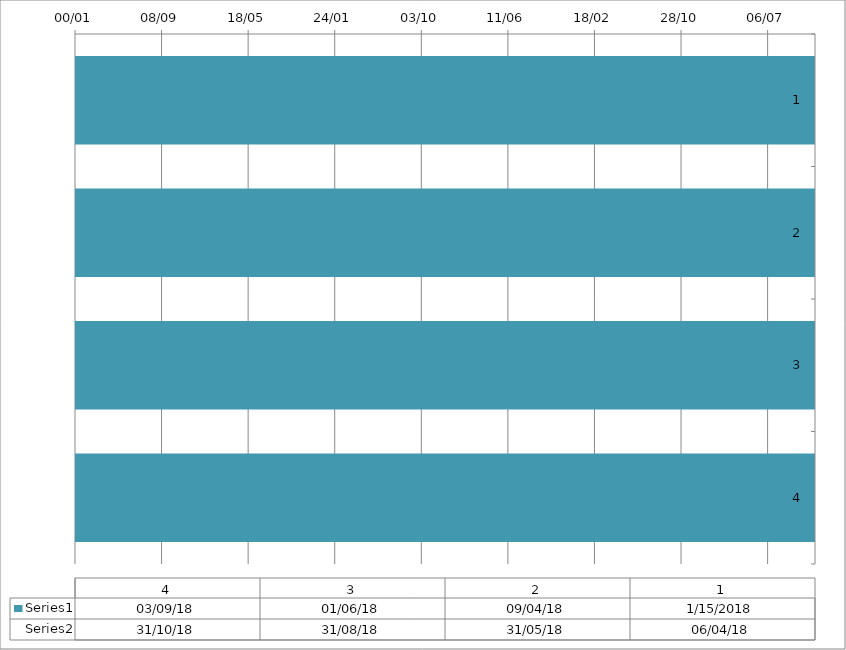
| Category | Series 4 | Series 5 |
|---|---|---|
| 0 | 2018-01-15 | 2018-04-06 |
| 1 | 2018-04-09 | 2018-05-31 |
| 2 | 2018-06-01 | 2018-08-31 |
| 3 | 2018-09-03 | 2018-10-31 |